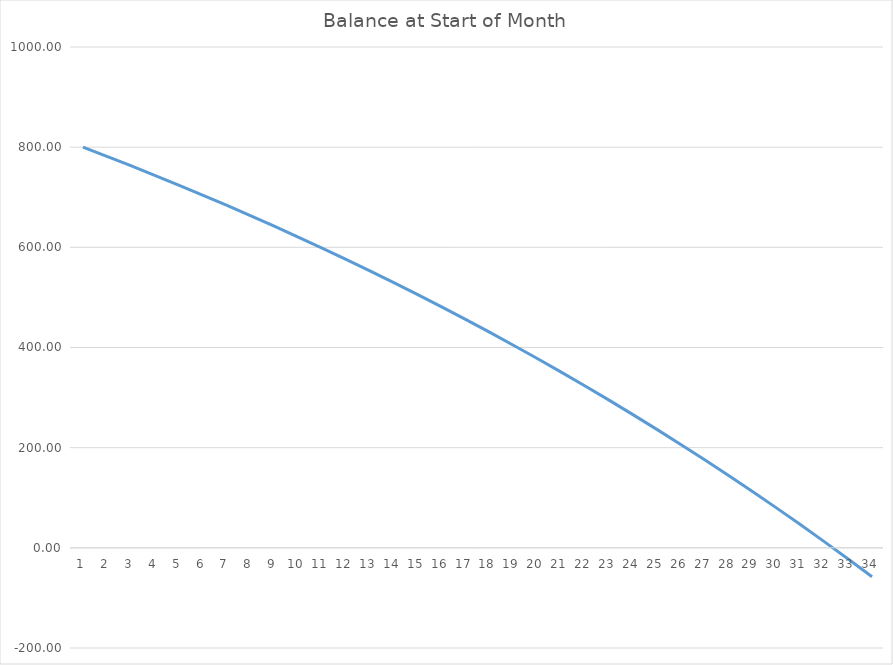
| Category | Balance at Start of Month |
|---|---|
| 0 | 800 |
| 1 | 781.667 |
| 2 | 762.951 |
| 3 | 743.846 |
| 4 | 724.343 |
| 5 | 704.433 |
| 6 | 684.109 |
| 7 | 663.361 |
| 8 | 642.181 |
| 9 | 620.56 |
| 10 | 598.489 |
| 11 | 575.957 |
| 12 | 552.956 |
| 13 | 529.476 |
| 14 | 505.507 |
| 15 | 481.038 |
| 16 | 456.06 |
| 17 | 430.561 |
| 18 | 404.531 |
| 19 | 377.959 |
| 20 | 350.833 |
| 21 | 323.142 |
| 22 | 294.874 |
| 23 | 266.017 |
| 24 | 236.559 |
| 25 | 206.488 |
| 26 | 175.79 |
| 27 | 144.452 |
| 28 | 112.461 |
| 29 | 79.804 |
| 30 | 46.467 |
| 31 | 12.435 |
| 32 | -22.306 |
| 33 | -57.771 |